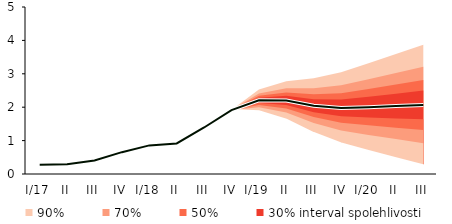
| Category | linka | Centerline |
|---|---|---|
| I/17 | 0.28 | 0.28 |
| II | 0.294 | 0.294 |
| III | 0.402 | 0.402 |
| IV | 0.654 | 0.654 |
| I/18 | 0.857 | 0.857 |
| II | 0.916 | 0.916 |
| III | 1.393 | 1.393 |
| IV | 1.913 | 1.913 |
| I/19 | 2.205 | 2.205 |
| II | 2.203 | 2.203 |
| III | 2.046 | 2.046 |
| IV | 1.979 | 1.979 |
| I/20 | 2.001 | 2.001 |
| II | 2.033 | 2.033 |
| III | 2.067 | 2.067 |